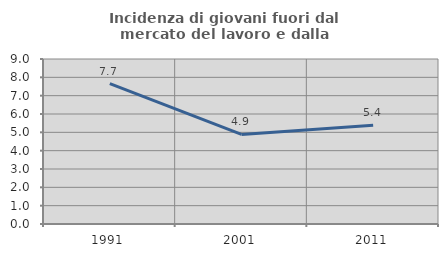
| Category | Incidenza di giovani fuori dal mercato del lavoro e dalla formazione  |
|---|---|
| 1991.0 | 7.659 |
| 2001.0 | 4.884 |
| 2011.0 | 5.391 |